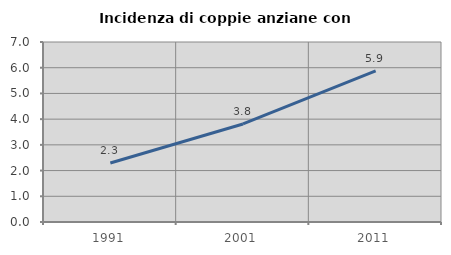
| Category | Incidenza di coppie anziane con figli |
|---|---|
| 1991.0 | 2.293 |
| 2001.0 | 3.812 |
| 2011.0 | 5.877 |